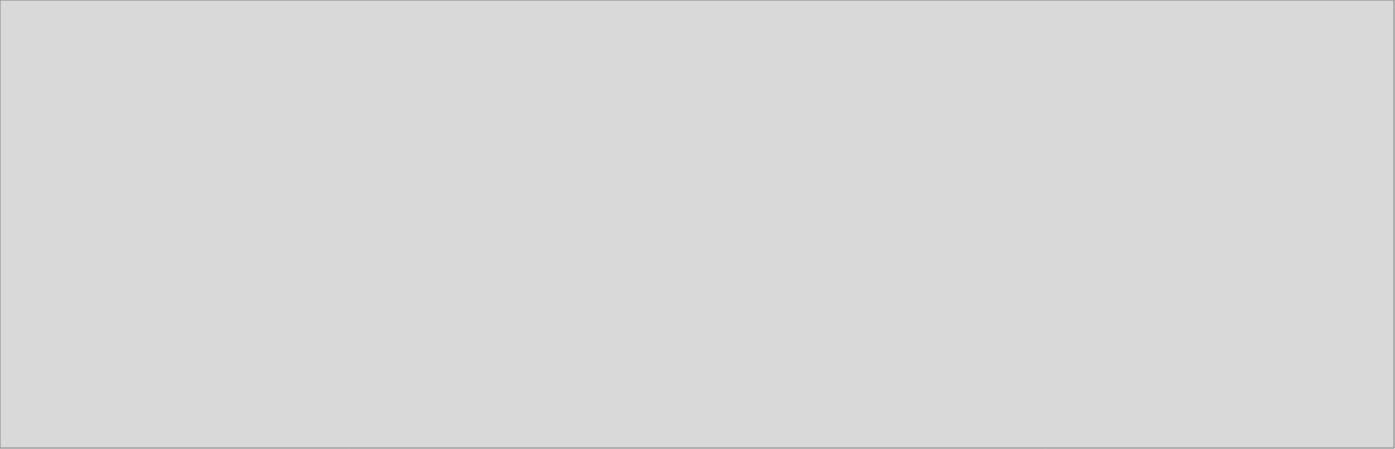
| Category | Servicios Sociales y de Salud |
|---|---|
| 2018_I | 4101.862 |
| 2018_II | 4095.492 |
| 2018_III | 4087.451 |
| 2018_IV | 4146.88 |
| 2019_I | 4406.677 |
| 2019_II | 4667.88 |
| 2019_III | 0 |
| 2019_IV | 0 |